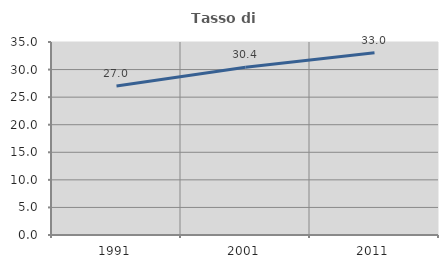
| Category | Tasso di occupazione   |
|---|---|
| 1991.0 | 27.003 |
| 2001.0 | 30.437 |
| 2011.0 | 33.04 |